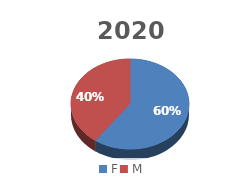
| Category | Series 2 | Series 3 | Series 1 | Series 0 |
|---|---|---|---|---|
| F | 2421 | 2424 | 2474 | 2424 |
| M | 1622 | 1781 | 1861 | 1781 |